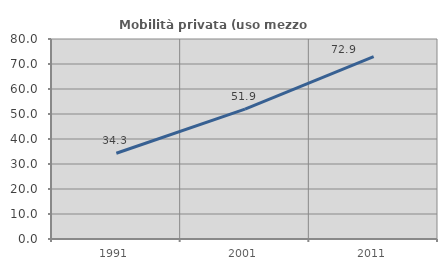
| Category | Mobilità privata (uso mezzo privato) |
|---|---|
| 1991.0 | 34.286 |
| 2001.0 | 51.923 |
| 2011.0 | 72.917 |